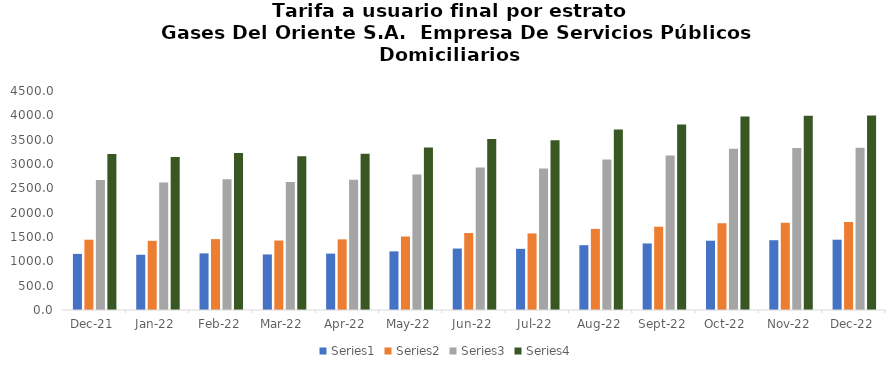
| Category | Series 0 | Series 1 | Series 2 | Series 3 |
|---|---|---|---|---|
| 2021-12-01 | 1152.94 | 1444.18 | 2669.52 | 3203.424 |
| 2022-01-01 | 1135.52 | 1421.55 | 2620.4 | 3144.48 |
| 2022-02-01 | 1162.74 | 1456.54 | 2688.25 | 3225.9 |
| 2022-03-01 | 1141.46 | 1427.8 | 2631.42 | 3157.704 |
| 2022-04-01 | 1158.72 | 1451.12 | 2676.82 | 3212.184 |
| 2022-05-01 | 1204.73 | 1510.34 | 2784.06 | 3340.872 |
| 2022-06-01 | 1262.94 | 1581.51 | 2927.04 | 3512.448 |
| 2022-07-01 | 1256.88 | 1573.21 | 2908.56 | 3490.272 |
| 2022-08-01 | 1331.73 | 1667.06 | 3090.43 | 3708.516 |
| 2022-09-01 | 1367.51 | 1711.63 | 3176.14 | 3811.368 |
| 2022-10-01 | 1423.49 | 1781.6 | 3315.35 | 3978.42 |
| 2022-11-01 | 1433.79 | 1794.38 | 3327.1 | 3992.52 |
| 2022-12-01 | 1444.79 | 1808.19 | 3331.66 | 3997.992 |